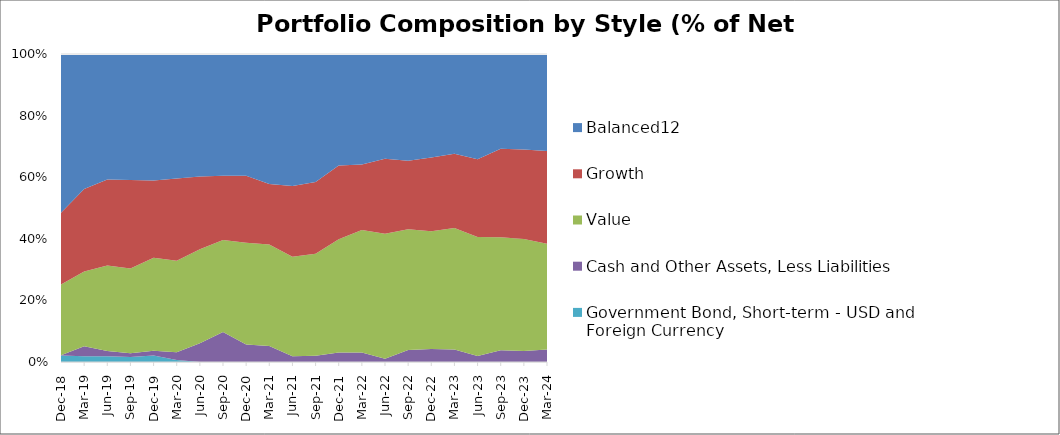
| Category | Government Bond, Short-term - USD and Foreign Currency | Cash and Other Assets, Less Liabilities | Value | Growth | Balanced12 |
|---|---|---|---|---|---|
| 2018-12-31 | 2.07 | 0.12 | 22.95 | 23.35 | 51.51 |
| 2019-03-31 | 1.88 | 3.24 | 24.23 | 26.83 | 43.82 |
| 2019-06-30 | 1.84 | 1.71 | 27.78 | 27.96 | 40.71 |
| 2019-09-30 | 1.64 | 1.24 | 27.46 | 28.77 | 40.89 |
| 2019-12-31 | 2.07 | 1.62 | 30.17 | 25.09 | 41.05 |
| 2020-03-31 | 0.64 | 2.52 | 29.72 | 26.66 | 40.46 |
| 2020-06-30 | 0 | 6.07 | 30.54 | 23.58 | 39.81 |
| 2020-09-30 | 0 | 9.73 | 29.88 | 20.87 | 39.52 |
| 2020-12-31 | 0 | 5.7 | 32.98 | 21.8 | 39.52 |
| 2021-03-31 | 0 | 5.21 | 32.93 | 19.65 | 42.21 |
| 2021-06-30 | 0 | 1.86 | 32.32 | 22.93 | 42.89 |
| 2021-09-30 | 0 | 2.05 | 33.13 | 23.28 | 41.54 |
| 2021-12-31 | 0 | 3.06 | 36.79 | 23.91 | 36.24 |
| 2022-03-31 | 0 | 3.11 | 39.72 | 21.31 | 35.86 |
| 2022-06-30 | 0 | 1.04 | 40.61 | 24.35 | 34 |
| 2022-09-30 | 0 | 3.87 | 39.24 | 22.27 | 34.62 |
| 2022-12-31 | 0 | 4.21 | 38.23 | 23.92 | 33.64 |
| 2023-03-31 | 0 | 4.08 | 39.46 | 24.08 | 32.38 |
| 2023-06-30 | 0 | 1.94 | 38.63 | 25.22 | 34.21 |
| 2023-09-30 | 0 | 3.81 | 36.67 | 28.72 | 30.8 |
| 2023-12-31 | 0 | 3.58 | 36.34 | 29.06 | 31.02 |
| 2024-03-31 | 0 | 4.05 | 34.37 | 30.06 | 31.52 |